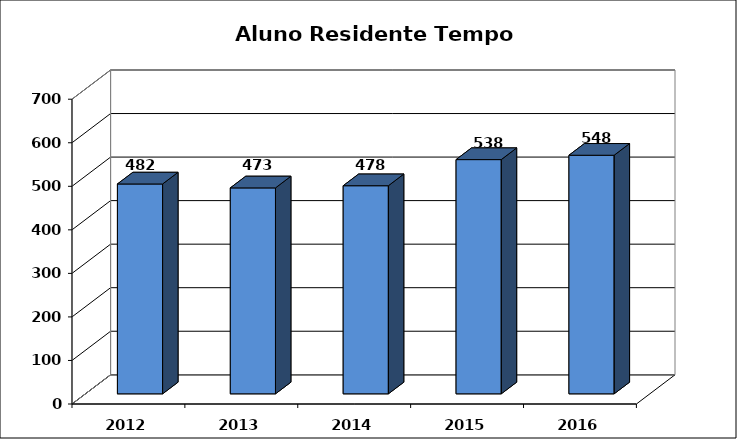
| Category | Series 0 |
|---|---|
| 2012.0 | 482 |
| 2013.0 | 473 |
| 2014.0 | 478 |
| 2015.0 | 538 |
| 2016.0 | 548 |